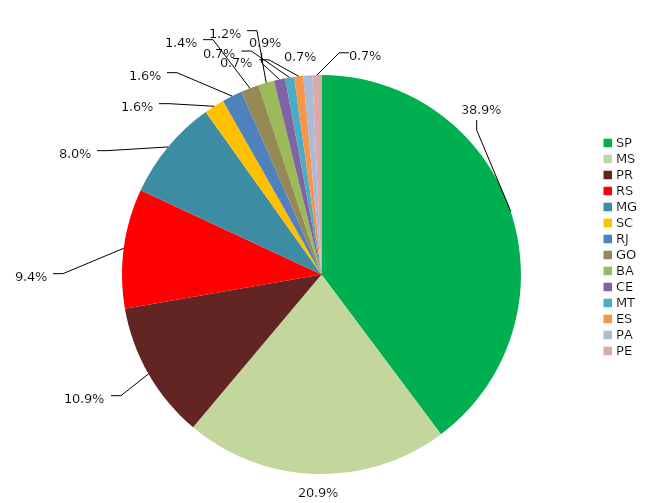
| Category | Series 0 | Series 1 |
|---|---|---|
| SP | 0.389 | 0.395 |
| MS | 0.209 | 0.2 |
| PR | 0.109 | 0.098 |
| RS | 0.094 | 0.102 |
| MG | 0.08 | 0.089 |
| SC | 0.016 | 0.017 |
| RJ | 0.016 | 0.013 |
| GO | 0.014 | 0.019 |
| BA | 0.012 | 0.008 |
| CE | 0.009 | 0.008 |
| MT | 0.007 | 0.009 |
| ES | 0.007 | 0.008 |
| PA | 0.007 | 0.008 |
| PE | 0.007 | 0.004 |